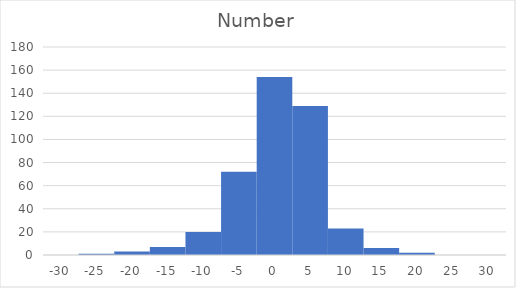
| Category | Anzahl |
|---|---|
| -30.0 | 0 |
| -25.0 | 1 |
| -20.0 | 3 |
| -15.0 | 7 |
| -10.0 | 20 |
| -5.0 | 72 |
| 0.0 | 154 |
| 5.0 | 129 |
| 10.0 | 23 |
| 15.0 | 6 |
| 20.0 | 2 |
| 25.0 | 0 |
| 30.0 | 0 |